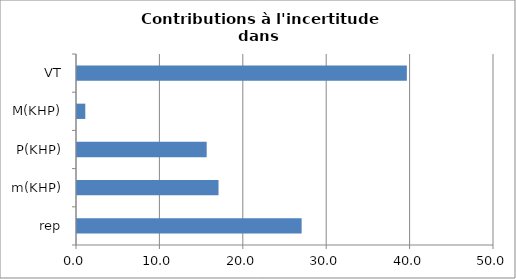
| Category | Series 0 |
|---|---|
| rep | 26.935 |
| m(KHP) | 16.969 |
| P(KHP) | 15.551 |
| M(KHP) | 0.993 |
| VT | 39.552 |